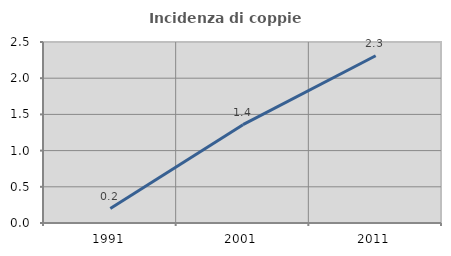
| Category | Incidenza di coppie miste |
|---|---|
| 1991.0 | 0.2 |
| 2001.0 | 1.358 |
| 2011.0 | 2.31 |